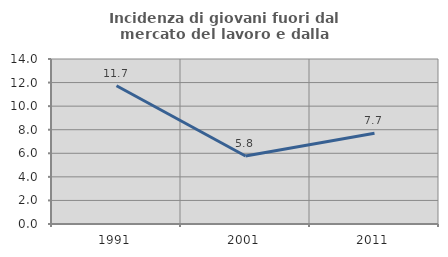
| Category | Incidenza di giovani fuori dal mercato del lavoro e dalla formazione  |
|---|---|
| 1991.0 | 11.735 |
| 2001.0 | 5.769 |
| 2011.0 | 7.692 |